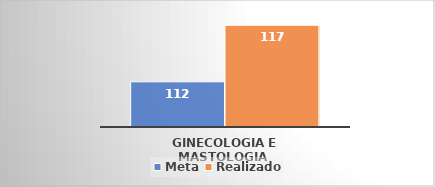
| Category | Meta | Realizado |
|---|---|---|
| Ginecologia e Mastologia  | 112 | 117 |